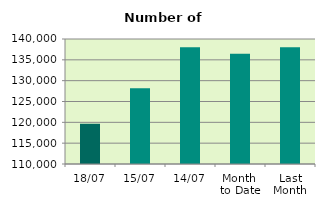
| Category | Series 0 |
|---|---|
| 18/07 | 119660 |
| 15/07 | 128200 |
| 14/07 | 138014 |
| Month 
to Date | 136471.833 |
| Last
Month | 138016.909 |